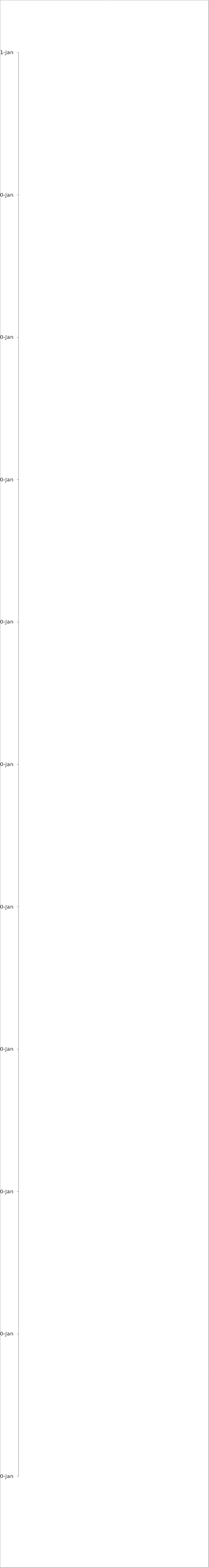
| Category | Women's Student Union  801415 $68  Expense OfficeMax Papper n/a n/a |
|---|---|
| 2012-07-24 | 0 |